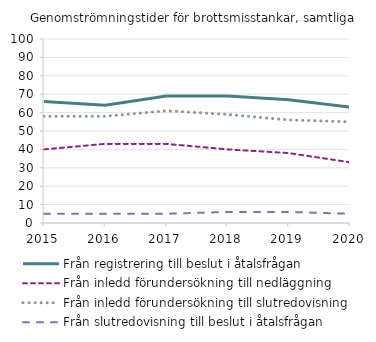
| Category | Från registrering till beslut i åtalsfrågan | Från inledd förundersökning till nedläggning | Från inledd förundersökning till slutredovisning | Från slutredovisning till beslut i åtalsfrågan |
|---|---|---|---|---|
| 2015 | 66 | 40 | 58 | 5 |
| 2016 | 64 | 43 | 58 | 5 |
| 2017 | 69 | 43 | 61 | 5 |
| 2018 | 69 | 40 | 59 | 6 |
| 2019 | 67 | 38 | 56 | 6 |
| 2020 | 63 | 33 | 55 | 5 |